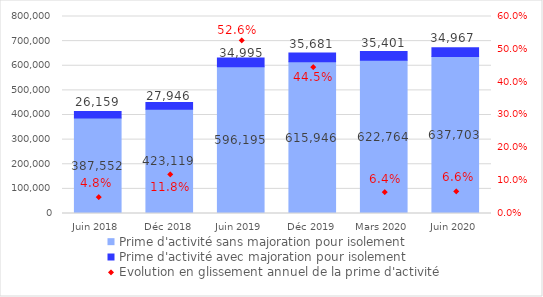
| Category | Prime d'activité sans majoration pour isolement | Prime d'activité avec majoration pour isolement |
|---|---|---|
| Juin 2018 | 387552 | 26159 |
| Déc 2018 | 423119 | 27946 |
| Juin 2019 | 596195 | 34995 |
| Déc 2019 | 615946 | 35681 |
| Mars 2020 | 622764 | 35401 |
| Juin 2020 | 637703 | 34967 |